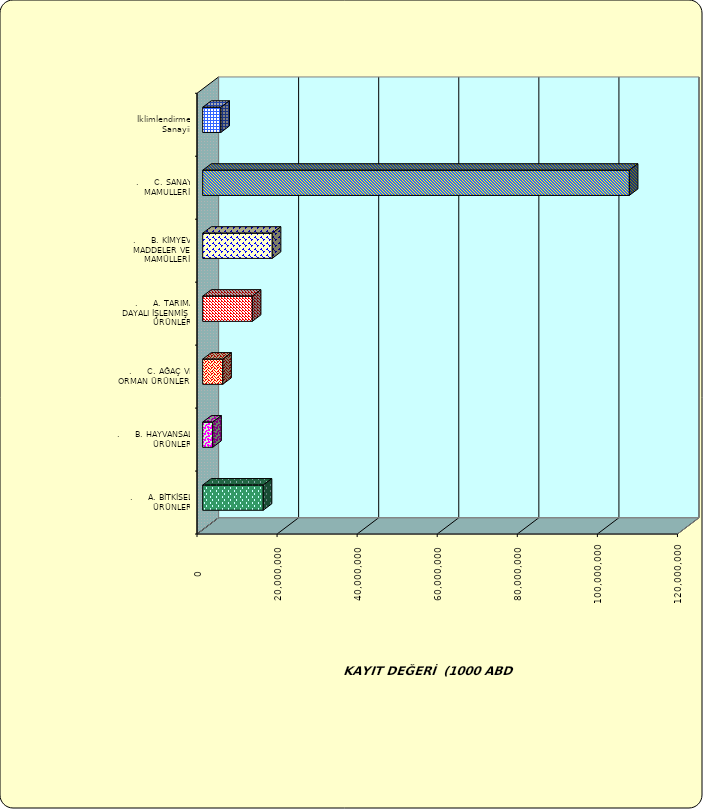
| Category | Series 0 |
|---|---|
| .     A. BİTKİSEL ÜRÜNLER | 15117103.347 |
| .     B. HAYVANSAL ÜRÜNLER | 2513892.804 |
| .     C. AĞAÇ VE ORMAN ÜRÜNLERİ | 5014612.984 |
| .     A. TARIMA DAYALI İŞLENMİŞ ÜRÜNLER | 12395159.601 |
| .     B. KİMYEVİ MADDELER VE MAMÜLLERİ | 17372117.197 |
| .     C. SANAYİ MAMULLERİ | 106558020.621 |
|  İklimlendirme Sanayii | 4533720.596 |